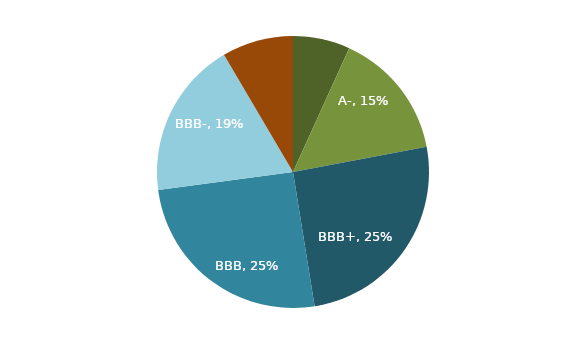
| Category | Series 0 |
|---|---|
| A or higher | 0.068 |
| A- | 0.153 |
| BBB+ | 0.254 |
| BBB | 0.254 |
| BBB- | 0.186 |
| Below BBB- | 0.085 |